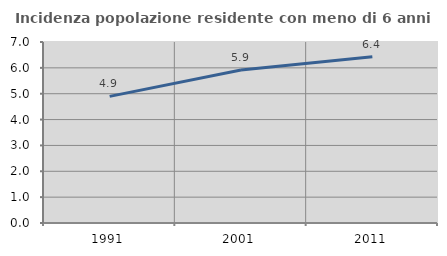
| Category | Incidenza popolazione residente con meno di 6 anni |
|---|---|
| 1991.0 | 4.896 |
| 2001.0 | 5.914 |
| 2011.0 | 6.426 |